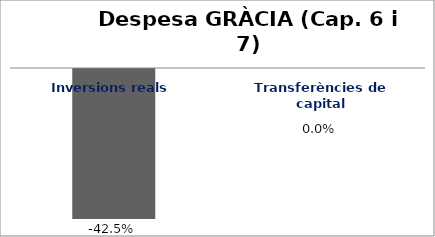
| Category | Series 0 |
|---|---|
| Inversions reals | -0.425 |
| Transferències de capital | 0 |